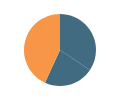
| Category | Series 0 |
|---|---|
| 0 | 0.35 |
| 1 | 0.23 |
| 2 | 0.44 |